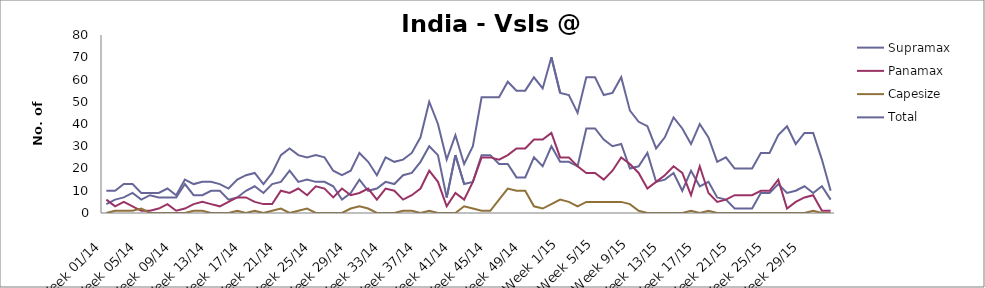
| Category | Supramax | Panamax | Capesize | Total |
|---|---|---|---|---|
| Week 01/14 | 4 | 6 | 0 | 10 |
| Week 02/14 | 6 | 3 | 1 | 10 |
| Week 03/14 | 7 | 5 | 1 | 13 |
| Week 04/14 | 9 | 3 | 1 | 13 |
| Week 05/14 | 6 | 1 | 2 | 9 |
| Week 06/14 | 8 | 1 | 0 | 9 |
| Week 07/14 | 7 | 2 | 0 | 9 |
| Week 08/14 | 7 | 4 | 0 | 11 |
| Week 09/14 | 7 | 1 | 0 | 8 |
| Week 10/14 | 13 | 2 | 0 | 15 |
| Week 11/14 | 8 | 4 | 1 | 13 |
| Week 12/14 | 8 | 5 | 1 | 14 |
| Week 13/14 | 10 | 4 | 0 | 14 |
| Week 14/14 | 10 | 3 | 0 | 13 |
| Week 15/14 | 6 | 5 | 0 | 11 |
| Week 16/14 | 7 | 7 | 1 | 15 |
| Week 17/14 | 10 | 7 | 0 | 17 |
| Week 18/14 | 12 | 5 | 1 | 18 |
| Week 19/14 | 9 | 4 | 0 | 13 |
| Week 20/14 | 13 | 4 | 1 | 18 |
| Week 21/14 | 14 | 10 | 2 | 26 |
| Week 22/14 | 19 | 9 | 0 | 29 |
| Week 23/14 | 14 | 11 | 1 | 26 |
| Week 24/14 | 15 | 8 | 2 | 25 |
| Week 25/14 | 14 | 12 | 0 | 26 |
| Week 26/14 | 14 | 11 | 0 | 25 |
| Week 27/14 | 12 | 7 | 0 | 19 |
| Week 28/14 | 6 | 11 | 0 | 17 |
| Week 29/14 | 9 | 8 | 2 | 19 |
| Week 30/14 | 15 | 9 | 3 | 27 |
| Week 31/14 | 10 | 11 | 2 | 23 |
| Week 32/14 | 11 | 6 | 0 | 17 |
| Week 33/14 | 14 | 11 | 0 | 25 |
| Week 34/14 | 13 | 10 | 0 | 23 |
| Week 35/14 | 17 | 6 | 1 | 24 |
| Week 36/14 | 18 | 8 | 1 | 27 |
| Week 37/14 | 23 | 11 | 0 | 34 |
| Week 38/14 | 30 | 19 | 1 | 50 |
| Week 39/14 | 26 | 14 | 0 | 40 |
| Week 40/14 | 7 | 3 | 0 | 24 |
| Week 41/14 | 26 | 9 | 0 | 35 |
| Week 42/14 | 13 | 6 | 3 | 22 |
| Week 43/14 | 14 | 14 | 2 | 30 |
| Week 44/14 | 26 | 25 | 1 | 52 |
| Week 45/14 | 26 | 25 | 1 | 52 |
| Week 46/14 | 22 | 24 | 6 | 52 |
| Week 47/14 | 22 | 26 | 11 | 59 |
| Week 48/14 | 16 | 29 | 10 | 55 |
| Week 49/14 | 16 | 29 | 10 | 55 |
| Week 50/14 | 25 | 33 | 3 | 61 |
| Week 51/14 | 21 | 33 | 2 | 56 |
| Week 52/14 | 30 | 36 | 4 | 70 |
| Week 1/15 | 23 | 25 | 6 | 54 |
| Week 2/15 | 23 | 25 | 5 | 53 |
| Week 3/15 | 21 | 21 | 3 | 45 |
| Week 4/15 | 38 | 18 | 5 | 61 |
| Week 5/15 | 38 | 18 | 5 | 61 |
| Week 6/15 | 33 | 15 | 5 | 53 |
| Week 7/15 | 30 | 19 | 5 | 54 |
| Week 8/15 | 31 | 25 | 5 | 61 |
| Week 9/15 | 20 | 22 | 4 | 46 |
| Week 10/15 | 21 | 18 | 1 | 41 |
| Week 11/15 | 27 | 11 | 0 | 39 |
| Week 12/15 | 14 | 14 | 0 | 29 |
| Week 13/15 | 15 | 17 | 0 | 34 |
| Week 14/15 | 18 | 21 | 0 | 43 |
| Week 15/15 | 10 | 18 | 0 | 38 |
| Week 16/15 | 19 | 8 | 1 | 31 |
| Week 17/15 | 12 | 21 | 0 | 40 |
| Week 18/15 | 14 | 9 | 1 | 34 |
| Week 19/15 | 7 | 5 | 0 | 23 |
| Week 20/15 | 6 | 6 | 0 | 25 |
| Week 21/15 | 2 | 8 | 0 | 20 |
| Week 22/15 | 2 | 8 | 0 | 20 |
| Week 23/15 | 2 | 8 | 0 | 20 |
| Week 24/15 | 9 | 10 | 0 | 27 |
| Week 25/15 | 9 | 10 | 0 | 27 |
| Week 26/15 | 13 | 15 | 0 | 35 |
| Week 27/15 | 9 | 2 | 0 | 39 |
| Week 28/15 | 10 | 5 | 0 | 31 |
| Week 29/15 | 12 | 7 | 0 | 36 |
| Week 30/15 | 9 | 8 | 1 | 36 |
| Week 31/15 | 12 | 1 | 0 | 24 |